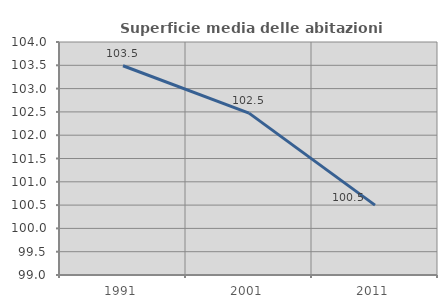
| Category | Superficie media delle abitazioni occupate |
|---|---|
| 1991.0 | 103.49 |
| 2001.0 | 102.474 |
| 2011.0 | 100.5 |